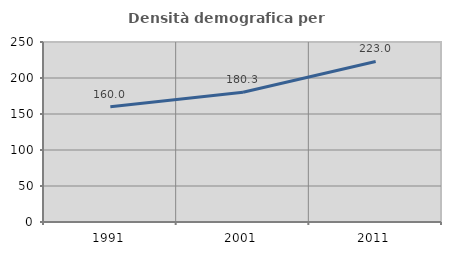
| Category | Densità demografica |
|---|---|
| 1991.0 | 159.99 |
| 2001.0 | 180.256 |
| 2011.0 | 222.998 |